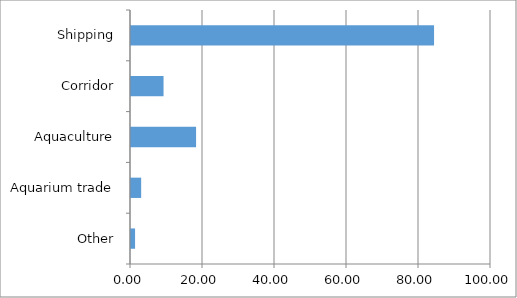
| Category | Series 0 |
|---|---|
| Other | 1.13 |
| Aquarium trade | 2.825 |
| Aquaculture | 18.079 |
| Corridor | 9.04 |
| Shipping | 84.181 |